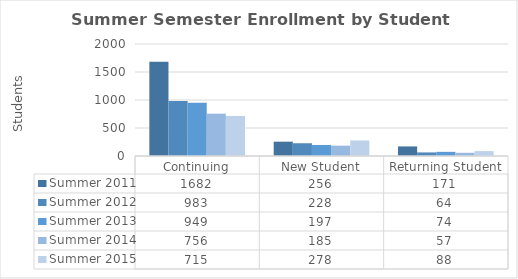
| Category | Summer 2011 | Summer 2012 | Summer 2013 | Summer 2014 | Summer 2015 |
|---|---|---|---|---|---|
| Continuing | 1682 | 983 | 949 | 756 | 715 |
| New Student | 256 | 228 | 197 | 185 | 278 |
| Returning Student | 171 | 64 | 74 | 57 | 88 |